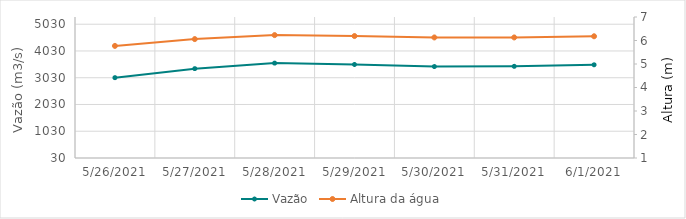
| Category | Vazão |
|---|---|
| 5/25/21 | 3173.52 |
| 5/24/21 | 3211.36 |
| 5/23/21 | 3168.4 |
| 5/22/21 | 3180.51 |
| 5/21/21 | 3138.85 |
| 5/20/21 | 2846.44 |
| 5/19/21 | 2726.52 |